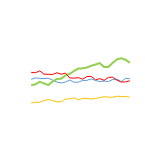
| Category | East | North | South | West |
|---|---|---|---|---|
| 0 | 5112 | 4553 | 5751 | 2941 |
| 1 | 5234 | 4650 | 5711 | 3007 |
| 2 | 5198 | 4884 | 5883 | 2996 |
| 3 | 5171 | 4730 | 5581 | 3157 |
| 4 | 5211 | 4586 | 5566 | 3260 |
| 5 | 5037 | 4906 | 5554 | 3152 |
| 6 | 4853 | 5142 | 5711 | 3046 |
| 7 | 4777 | 5157 | 5579 | 3050 |
| 8 | 4853 | 5474 | 5677 | 3294 |
| 9 | 5041 | 5607 | 5233 | 3310 |
| 10 | 4837 | 5877 | 5222 | 3413 |
| 11 | 4846 | 6099 | 5262 | 3225 |
| 12 | 4998 | 6115 | 5121 | 3367 |
| 13 | 5014 | 6193 | 5360 | 3356 |
| 14 | 5149 | 6352 | 5373 | 3304 |
| 15 | 5003 | 6473 | 5073 | 3352 |
| 16 | 4907 | 6597 | 5171 | 3422 |
| 17 | 4946 | 6230 | 5017 | 3516 |
| 18 | 4906 | 6245 | 5287 | 3477 |
| 19 | 5098 | 6626 | 5304 | 3457 |
| 20 | 5115 | 6941 | 5032 | 3561 |
| 21 | 4900 | 7038 | 4856 | 3519 |
| 22 | 5195 | 6905 | 4875 | 3535 |
| 23 | 5160 | 6628 | 4972 | 3458 |